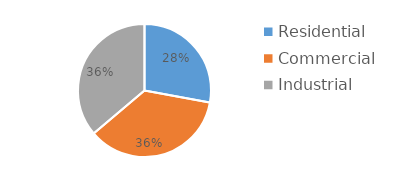
| Category | Series 0 |
|---|---|
| Residential | 19441640 |
| Commercial | 25053627 |
| Industrial | 25224550 |